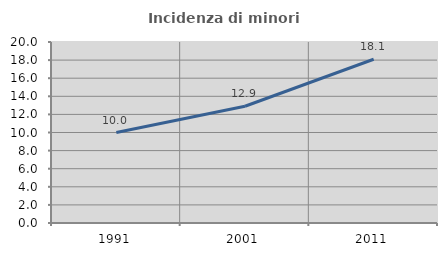
| Category | Incidenza di minori stranieri |
|---|---|
| 1991.0 | 10 |
| 2001.0 | 12.903 |
| 2011.0 | 18.095 |